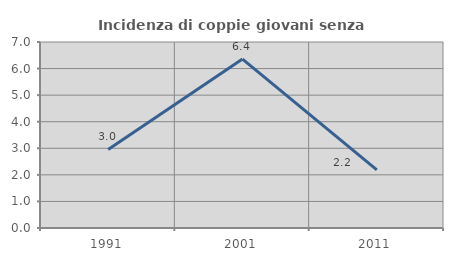
| Category | Incidenza di coppie giovani senza figli |
|---|---|
| 1991.0 | 2.959 |
| 2001.0 | 6.358 |
| 2011.0 | 2.186 |